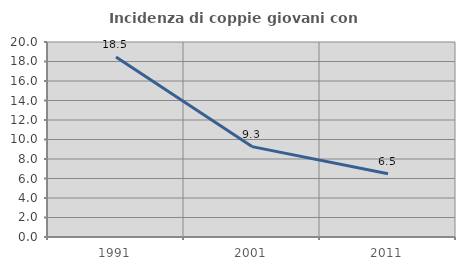
| Category | Incidenza di coppie giovani con figli |
|---|---|
| 1991.0 | 18.47 |
| 2001.0 | 9.272 |
| 2011.0 | 6.485 |